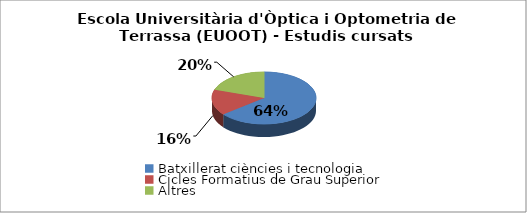
| Category | Escola Universitària d'Òptica i Optometria de Terrassa (EUOOT) - Estudis cursats |
|---|---|
| Batxillerat ciències i tecnologia | 0.642 |
| Cicles Formatius de Grau Superior | 0.16 |
| Altres | 0.198 |